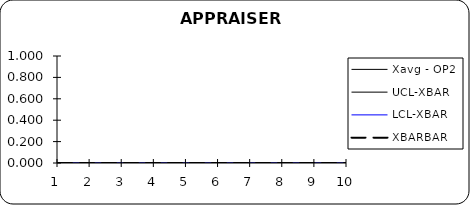
| Category | Xavg - OP2 | UCL-XBAR | LCL-XBAR | XBARBAR |
|---|---|---|---|---|
| 0 | 0 | 0 | 0 | 0 |
| 1 | 0 | 0 | 0 | 0 |
| 2 | 0 | 0 | 0 | 0 |
| 3 | 0 | 0 | 0 | 0 |
| 4 | 0 | 0 | 0 | 0 |
| 5 | 0 | 0 | 0 | 0 |
| 6 | 0 | 0 | 0 | 0 |
| 7 | 0 | 0 | 0 | 0 |
| 8 | 0 | 0 | 0 | 0 |
| 9 | 0 | 0 | 0 | 0 |